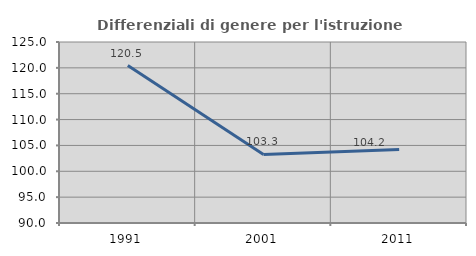
| Category | Differenziali di genere per l'istruzione superiore |
|---|---|
| 1991.0 | 120.455 |
| 2001.0 | 103.267 |
| 2011.0 | 104.204 |